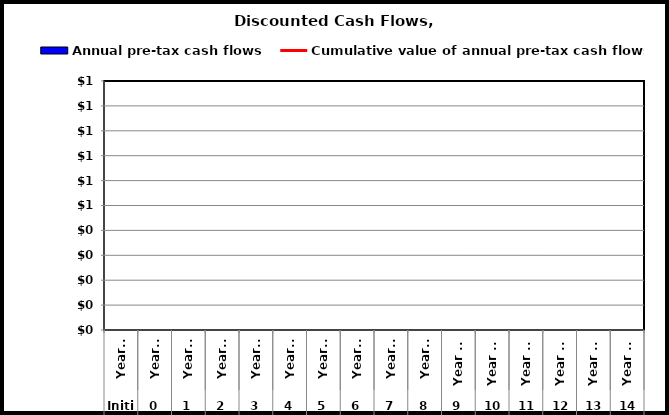
| Category | Annual pre-tax cash flows |
|---|---|
| 0 | 0 |
| 1 | 0 |
| 2 | 0 |
| 3 | 0 |
| 4 | 0 |
| 5 | 0 |
| 6 | 0 |
| 7 | 0 |
| 8 | 0 |
| 9 | 0 |
| 10 | 0 |
| 11 | 0 |
| 12 | 0 |
| 13 | 0 |
| 14 | 0 |
| 15 | 0 |